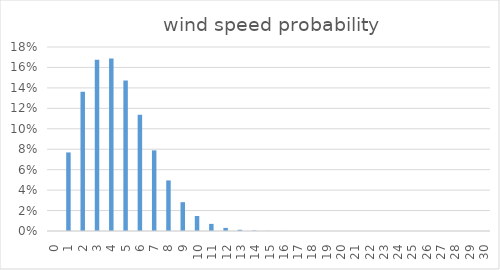
| Category | proba |
|---|---|
| 0.0 | 0 |
| 1.0 | 0.077 |
| 2.0 | 0.136 |
| 3.0 | 0.167 |
| 4.0 | 0.169 |
| 5.0 | 0.147 |
| 6.0 | 0.114 |
| 7.0 | 0.079 |
| 8.0 | 0.049 |
| 9.0 | 0.028 |
| 10.0 | 0.015 |
| 11.0 | 0.007 |
| 12.0 | 0.003 |
| 13.0 | 0.001 |
| 14.0 | 0 |
| 15.0 | 0 |
| 16.0 | 0 |
| 17.0 | 0 |
| 18.0 | 0 |
| 19.0 | 0 |
| 20.0 | 0 |
| 21.0 | 0 |
| 22.0 | 0 |
| 23.0 | 0 |
| 24.0 | 0 |
| 25.0 | 0 |
| 26.0 | 0 |
| 27.0 | 0 |
| 28.0 | 0 |
| 29.0 | 0 |
| 30.0 | 0 |